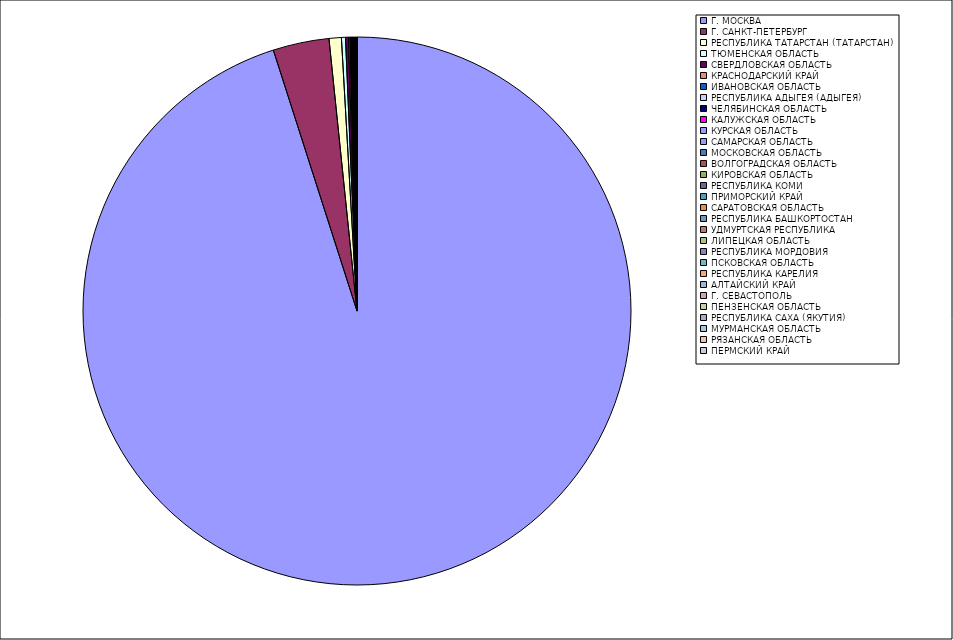
| Category | Оборот |
|---|---|
| Г. МОСКВА | 95.018 |
| Г. САНКТ-ПЕТЕРБУРГ | 3.305 |
| РЕСПУБЛИКА ТАТАРСТАН (ТАТАРСТАН) | 0.724 |
| ТЮМЕНСКАЯ ОБЛАСТЬ | 0.238 |
| СВЕРДЛОВСКАЯ ОБЛАСТЬ | 0.17 |
| КРАСНОДАРСКИЙ КРАЙ | 0.083 |
| ИВАНОВСКАЯ ОБЛАСТЬ | 0.04 |
| РЕСПУБЛИКА АДЫГЕЯ (АДЫГЕЯ) | 0.036 |
| ЧЕЛЯБИНСКАЯ ОБЛАСТЬ | 0.034 |
| КАЛУЖСКАЯ ОБЛАСТЬ | 0.029 |
| КУРСКАЯ ОБЛАСТЬ | 0.027 |
| САМАРСКАЯ ОБЛАСТЬ | 0.021 |
| МОСКОВСКАЯ ОБЛАСТЬ | 0.02 |
| ВОЛГОГРАДСКАЯ ОБЛАСТЬ | 0.02 |
| КИРОВСКАЯ ОБЛАСТЬ | 0.019 |
| РЕСПУБЛИКА КОМИ | 0.019 |
| ПРИМОРСКИЙ КРАЙ | 0.019 |
| САРАТОВСКАЯ ОБЛАСТЬ | 0.018 |
| РЕСПУБЛИКА БАШКОРТОСТАН | 0.012 |
| УДМУРТСКАЯ РЕСПУБЛИКА | 0.012 |
| ЛИПЕЦКАЯ ОБЛАСТЬ | 0.012 |
| РЕСПУБЛИКА МОРДОВИЯ | 0.011 |
| ПСКОВСКАЯ ОБЛАСТЬ | 0.01 |
| РЕСПУБЛИКА КАРЕЛИЯ | 0.01 |
| АЛТАЙСКИЙ КРАЙ | 0.008 |
| Г. СЕВАСТОПОЛЬ | 0.008 |
| ПЕНЗЕНСКАЯ ОБЛАСТЬ | 0.008 |
| РЕСПУБЛИКА САХА (ЯКУТИЯ) | 0.008 |
| МУРМАНСКАЯ ОБЛАСТЬ | 0.006 |
| РЯЗАНСКАЯ ОБЛАСТЬ | 0.006 |
| ПЕРМСКИЙ КРАЙ | 0.005 |